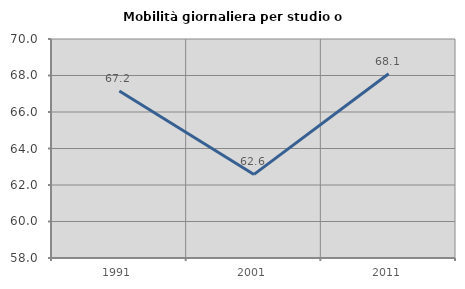
| Category | Mobilità giornaliera per studio o lavoro |
|---|---|
| 1991.0 | 67.152 |
| 2001.0 | 62.581 |
| 2011.0 | 68.096 |